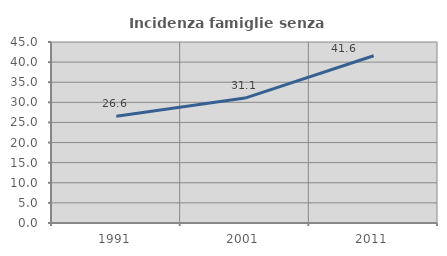
| Category | Incidenza famiglie senza nuclei |
|---|---|
| 1991.0 | 26.551 |
| 2001.0 | 31.06 |
| 2011.0 | 41.583 |